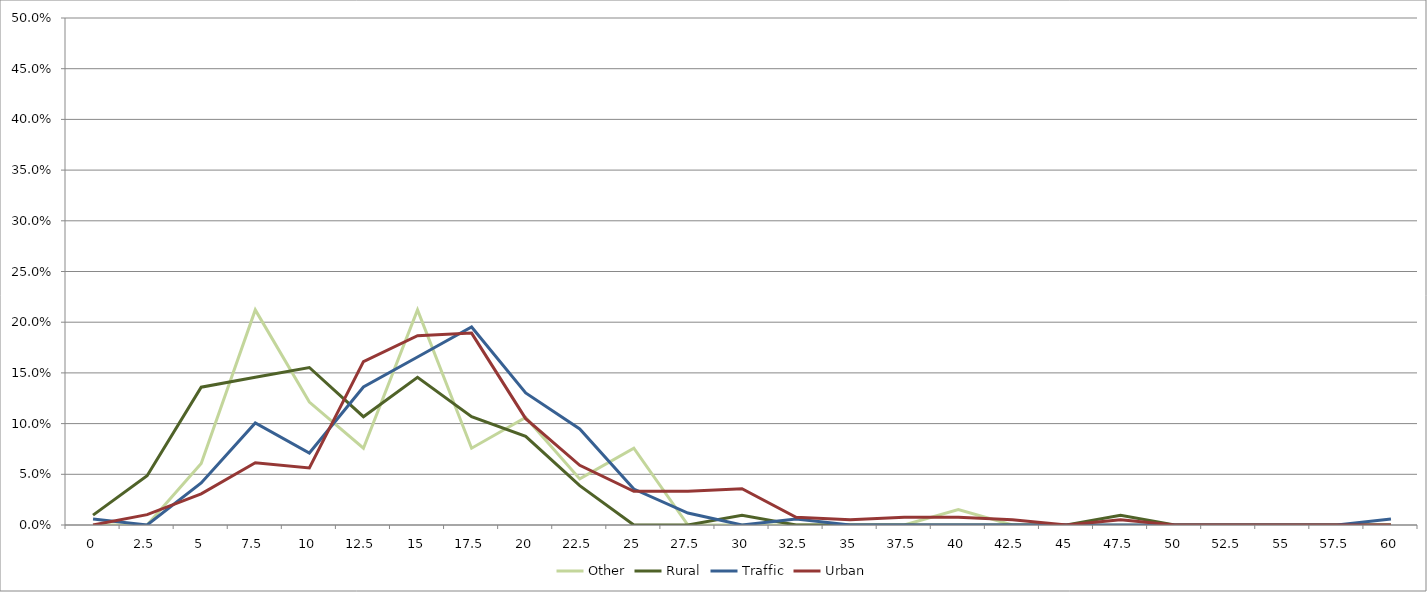
| Category | Other | Rural | Traffic | Urban |
|---|---|---|---|---|
| 0.0 | 0 | 0.01 | 0.006 | 0 |
| 2.5 | 0 | 0.049 | 0 | 0.01 |
| 5.0 | 0.061 | 0.136 | 0.041 | 0.031 |
| 7.5 | 0.212 | 0.146 | 0.101 | 0.061 |
| 10.0 | 0.121 | 0.155 | 0.071 | 0.056 |
| 12.5 | 0.076 | 0.107 | 0.136 | 0.161 |
| 15.0 | 0.212 | 0.146 | 0.166 | 0.187 |
| 17.5 | 0.076 | 0.107 | 0.195 | 0.189 |
| 20.0 | 0.106 | 0.087 | 0.13 | 0.105 |
| 22.5 | 0.045 | 0.039 | 0.095 | 0.059 |
| 25.0 | 0.076 | 0 | 0.036 | 0.033 |
| 27.5 | 0 | 0 | 0.012 | 0.033 |
| 30.0 | 0 | 0.01 | 0 | 0.036 |
| 32.5 | 0 | 0 | 0.006 | 0.008 |
| 35.0 | 0 | 0 | 0 | 0.005 |
| 37.5 | 0 | 0 | 0 | 0.008 |
| 40.0 | 0.015 | 0 | 0 | 0.008 |
| 42.5 | 0 | 0 | 0 | 0.005 |
| 45.0 | 0 | 0 | 0 | 0 |
| 47.5 | 0 | 0.01 | 0 | 0.005 |
| 50.0 | 0 | 0 | 0 | 0 |
| 52.5 | 0 | 0 | 0 | 0 |
| 55.0 | 0 | 0 | 0 | 0 |
| 57.5 | 0 | 0 | 0 | 0 |
| 60.0 | 0 | 0 | 0.006 | 0 |